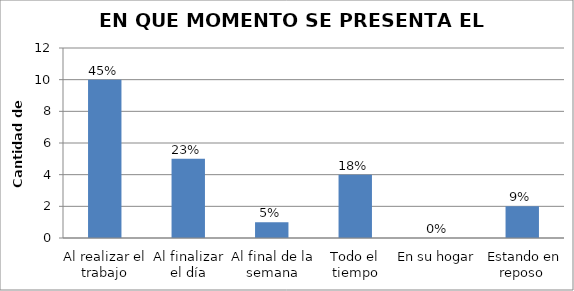
| Category | Series 0 |
|---|---|
| Al realizar el trabajo | 10 |
| Al finalizar el día | 5 |
| Al final de la semana | 1 |
| Todo el tiempo | 4 |
| En su hogar | 0 |
|  Estando en reposo | 2 |